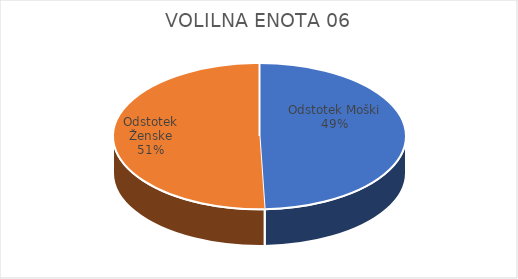
| Category | VOLILNA ENOTA 06 | #REF! | Slovenija skupaj |
|---|---|---|---|
| Odstotek Moški | 24.53 |  | 25.26 |
| Odstotek Ženske | 25.08 |  | 26.62 |